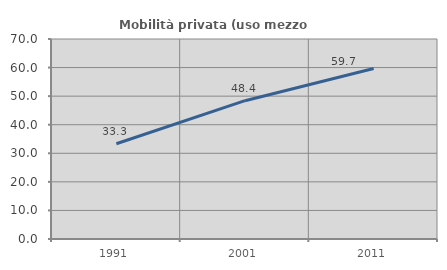
| Category | Mobilità privata (uso mezzo privato) |
|---|---|
| 1991.0 | 33.35 |
| 2001.0 | 48.408 |
| 2011.0 | 59.651 |